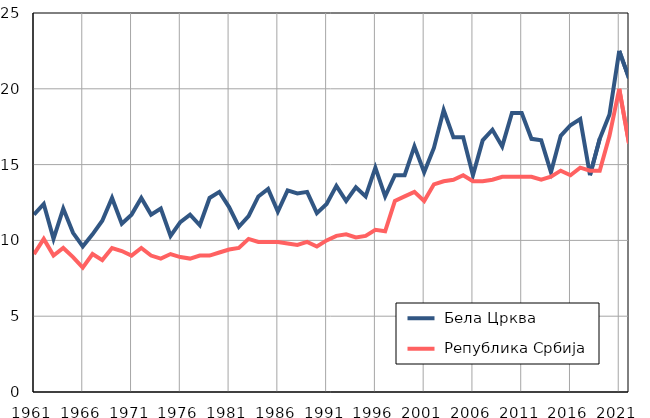
| Category |  Бела Црква |  Република Србија |
|---|---|---|
| 1961.0 | 11.7 | 9.1 |
| 1962.0 | 12.4 | 10.1 |
| 1963.0 | 10.1 | 9 |
| 1964.0 | 12.1 | 9.5 |
| 1965.0 | 10.5 | 8.9 |
| 1966.0 | 9.6 | 8.2 |
| 1967.0 | 10.4 | 9.1 |
| 1968.0 | 11.3 | 8.7 |
| 1969.0 | 12.8 | 9.5 |
| 1970.0 | 11.1 | 9.3 |
| 1971.0 | 11.7 | 9 |
| 1972.0 | 12.8 | 9.5 |
| 1973.0 | 11.7 | 9 |
| 1974.0 | 12.1 | 8.8 |
| 1975.0 | 10.3 | 9.1 |
| 1976.0 | 11.2 | 8.9 |
| 1977.0 | 11.7 | 8.8 |
| 1978.0 | 11 | 9 |
| 1979.0 | 12.8 | 9 |
| 1980.0 | 13.2 | 9.2 |
| 1981.0 | 12.2 | 9.4 |
| 1982.0 | 10.9 | 9.5 |
| 1983.0 | 11.6 | 10.1 |
| 1984.0 | 12.9 | 9.9 |
| 1985.0 | 13.4 | 9.9 |
| 1986.0 | 11.9 | 9.9 |
| 1987.0 | 13.3 | 9.8 |
| 1988.0 | 13.1 | 9.7 |
| 1989.0 | 13.2 | 9.9 |
| 1990.0 | 11.8 | 9.6 |
| 1991.0 | 12.4 | 10 |
| 1992.0 | 13.6 | 10.3 |
| 1993.0 | 12.6 | 10.4 |
| 1994.0 | 13.5 | 10.2 |
| 1995.0 | 12.9 | 10.3 |
| 1996.0 | 14.8 | 10.7 |
| 1997.0 | 12.9 | 10.6 |
| 1998.0 | 14.3 | 12.6 |
| 1999.0 | 14.3 | 12.9 |
| 2000.0 | 16.2 | 13.2 |
| 2001.0 | 14.5 | 12.6 |
| 2002.0 | 16.1 | 13.7 |
| 2003.0 | 18.6 | 13.9 |
| 2004.0 | 16.8 | 14 |
| 2005.0 | 16.8 | 14.3 |
| 2006.0 | 14.3 | 13.9 |
| 2007.0 | 16.6 | 13.9 |
| 2008.0 | 17.3 | 14 |
| 2009.0 | 16.2 | 14.2 |
| 2010.0 | 18.4 | 14.2 |
| 2011.0 | 18.4 | 14.2 |
| 2012.0 | 16.7 | 14.2 |
| 2013.0 | 16.6 | 14 |
| 2014.0 | 14.5 | 14.2 |
| 2015.0 | 16.9 | 14.6 |
| 2016.0 | 17.6 | 14.3 |
| 2017.0 | 18 | 14.8 |
| 2018.0 | 14.3 | 14.6 |
| 2019.0 | 16.7 | 14.6 |
| 2020.0 | 18.3 | 16.9 |
| 2021.0 | 22.5 | 20 |
| 2022.0 | 20.7 | 16.4 |